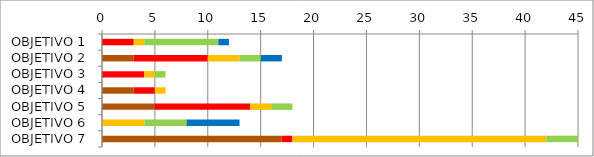
| Category | Series 0 | Series 1 | Series 2 | Series 3 | Series 4 | Series 5 |
|---|---|---|---|---|---|---|
| OBJETIVO 1 | 0 | 0 | 3 | 1 | 7 | 1 |
| OBJETIVO 2 | 3 | 0 | 7 | 3 | 2 | 2 |
| OBJETIVO 3 | 0 | 0 | 4 | 1 | 1 | 0 |
| OBJETIVO 4 | 3 | 0 | 2 | 1 | 0 | 0 |
| OBJETIVO 5 | 5 | 0 | 9 | 2 | 2 | 0 |
| OBJETIVO 6 | 0 | 0 | 0 | 4 | 4 | 5 |
| OBJETIVO 7 | 17 | 0 | 1 | 24 | 3 | 0 |